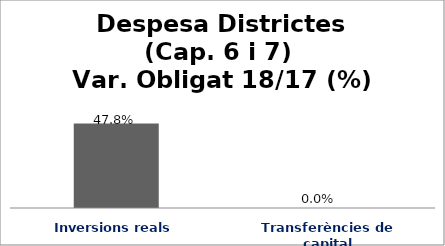
| Category | Series 0 |
|---|---|
| Inversions reals | 0.478 |
| Transferències de capital | 0 |